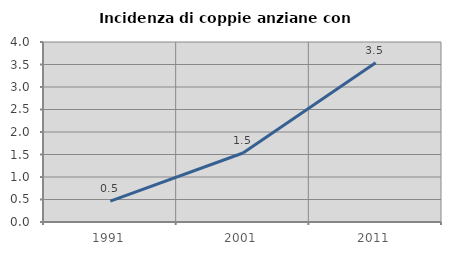
| Category | Incidenza di coppie anziane con figli |
|---|---|
| 1991.0 | 0.463 |
| 2001.0 | 1.533 |
| 2011.0 | 3.537 |